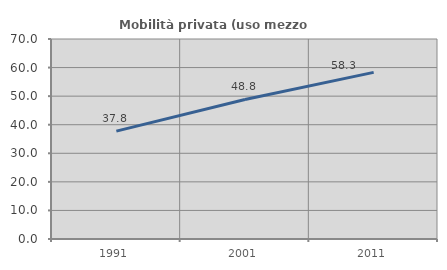
| Category | Mobilità privata (uso mezzo privato) |
|---|---|
| 1991.0 | 37.77 |
| 2001.0 | 48.846 |
| 2011.0 | 58.322 |